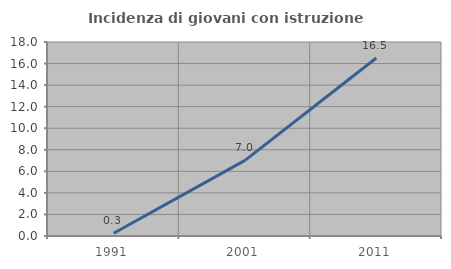
| Category | Incidenza di giovani con istruzione universitaria |
|---|---|
| 1991.0 | 0.256 |
| 2001.0 | 7.02 |
| 2011.0 | 16.518 |